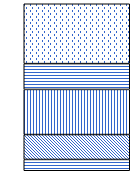
| Category | 18-25 | 25-30 | 30-40 | 40-50 | 50-65 |
|---|---|---|---|---|---|
| 0 | 754 | 1660 | 3009 | 1720 | 3991 |